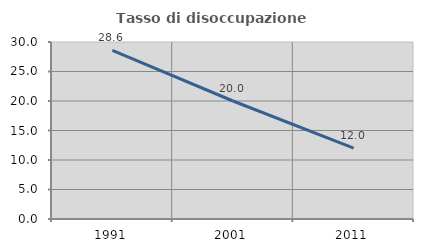
| Category | Tasso di disoccupazione giovanile  |
|---|---|
| 1991.0 | 28.571 |
| 2001.0 | 20 |
| 2011.0 | 12 |